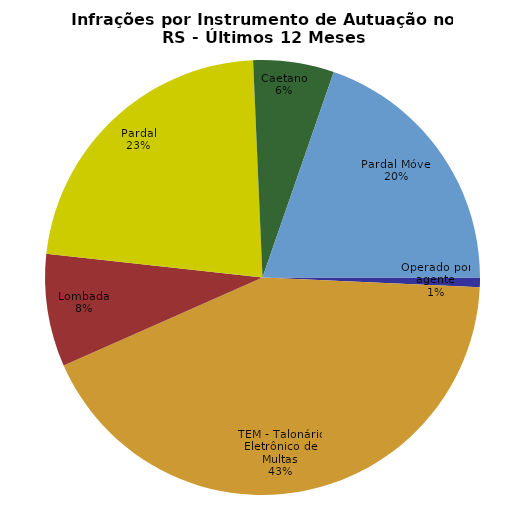
| Category | Últimos 12 Meses |
|---|---|
| Operado por agente | 17516 |
| TEM - Talonário Eletrônico de Multas | 1036267 |
| Lombada | 203329 |
| Pardal | 548591 |
| Caetano | 145867 |
| Pardal Móvel | 478392 |